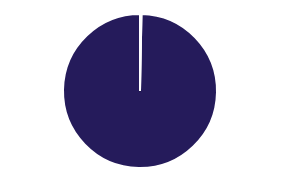
| Category | Series 0 |
|---|---|
| 0 | 0.003 |
| 1 | 0.997 |